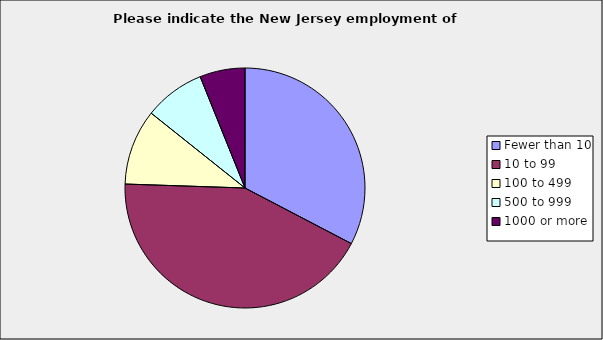
| Category | Series 0 |
|---|---|
| Fewer than 10 | 0.327 |
| 10 to 99 | 0.429 |
| 100 to 499 | 0.102 |
| 500 to 999 | 0.082 |
| 1000 or more | 0.061 |